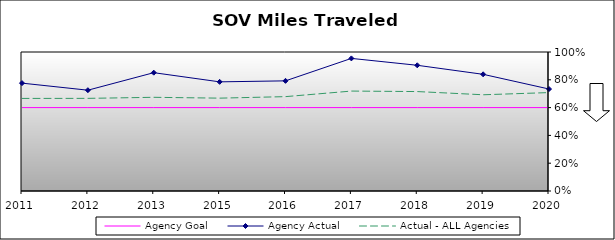
| Category | Agency Goal | Agency Actual | Actual - ALL Agencies |
|---|---|---|---|
| 2011.0 | 0.6 | 0.776 | 0.666 |
| 2012.0 | 0.6 | 0.725 | 0.666 |
| 2013.0 | 0.6 | 0.851 | 0.674 |
| 2015.0 | 0.6 | 0.785 | 0.668 |
| 2016.0 | 0.6 | 0.792 | 0.679 |
| 2017.0 | 0.6 | 0.954 | 0.719 |
| 2018.0 | 0.6 | 0.904 | 0.715 |
| 2019.0 | 0.6 | 0.839 | 0.692 |
| 2020.0 | 0.6 | 0.734 | 0.708 |